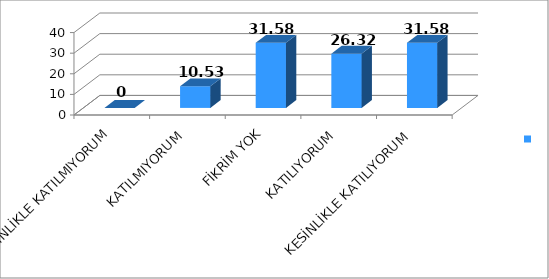
| Category | Series 0 |
|---|---|
| KESİNLİKLE KATILMIYORUM | 0 |
| KATILMIYORUM | 10.53 |
| FİKRİM YOK | 31.58 |
| KATILIYORUM | 26.32 |
| KESİNLİKLE KATILIYORUM | 31.58 |